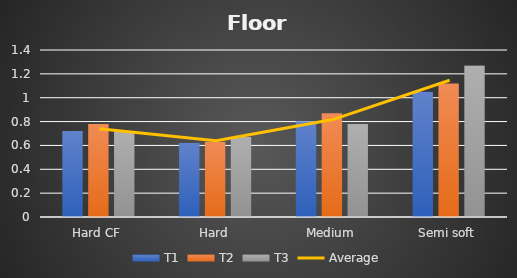
| Category | T1 | T2 | T3 |
|---|---|---|---|
| Hard CF | 0.72 | 0.78 | 0.72 |
| Hard | 0.62 | 0.63 | 0.67 |
| Medium | 0.8 | 0.87 | 0.78 |
| Semi soft | 1.05 | 1.12 | 1.27 |